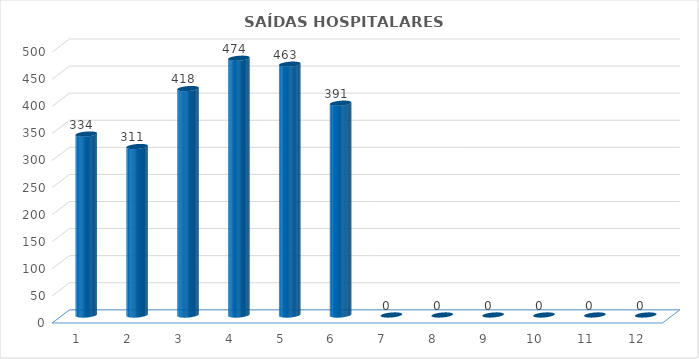
| Category | Series 0 |
|---|---|
| 0 | 334 |
| 1 | 311 |
| 2 | 418 |
| 3 | 474 |
| 4 | 463 |
| 5 | 391 |
| 6 | 0 |
| 7 | 0 |
| 8 | 0 |
| 9 | 0 |
| 10 | 0 |
| 11 | 0 |